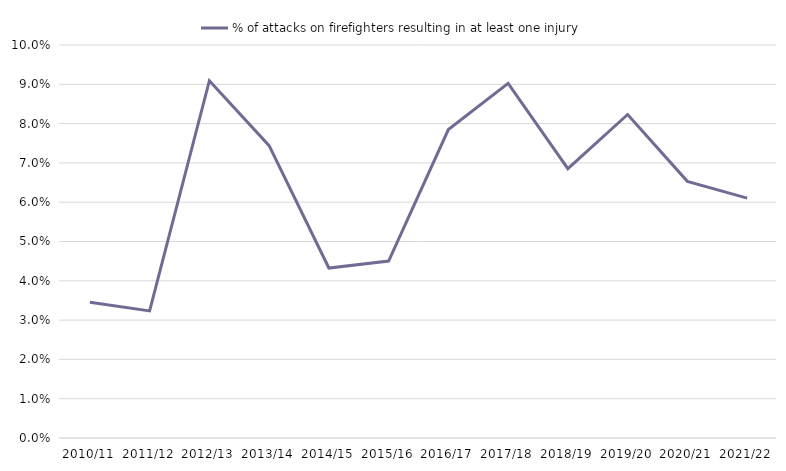
| Category | % of attacks on firefighters resulting in at least one injury |
|---|---|
| 2010/11 | 0.035 |
| 2011/12 | 0.032 |
| 2012/13 | 0.091 |
| 2013/14 | 0.074 |
| 2014/15 | 0.043 |
| 2015/16 | 0.045 |
| 2016/17 | 0.078 |
| 2017/18 | 0.09 |
| 2018/19 | 0.069 |
| 2019/20 | 0.082 |
| 2020/21 | 0.065 |
| 2021/22 | 0.061 |